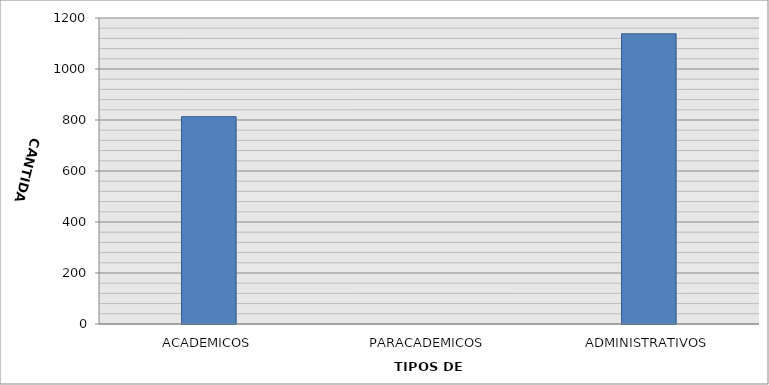
| Category | CANTIDAD |
|---|---|
| ACADEMICOS | 813 |
| PARACADEMICOS | 0 |
| ADMINISTRATIVOS | 1138 |